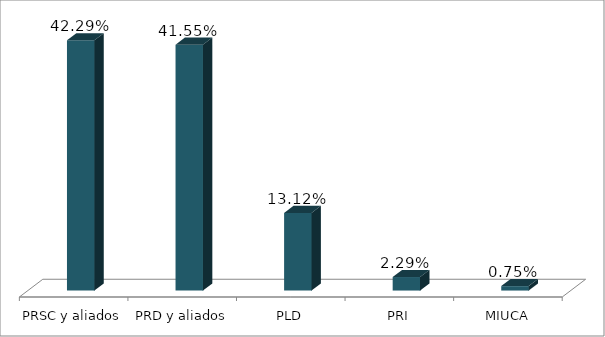
| Category | Votos % |
|---|---|
| PRSC y aliados | 0.423 |
| PRD y aliados | 0.416 |
| PLD | 0.131 |
| PRI | 0.023 |
| MIUCA | 0.007 |